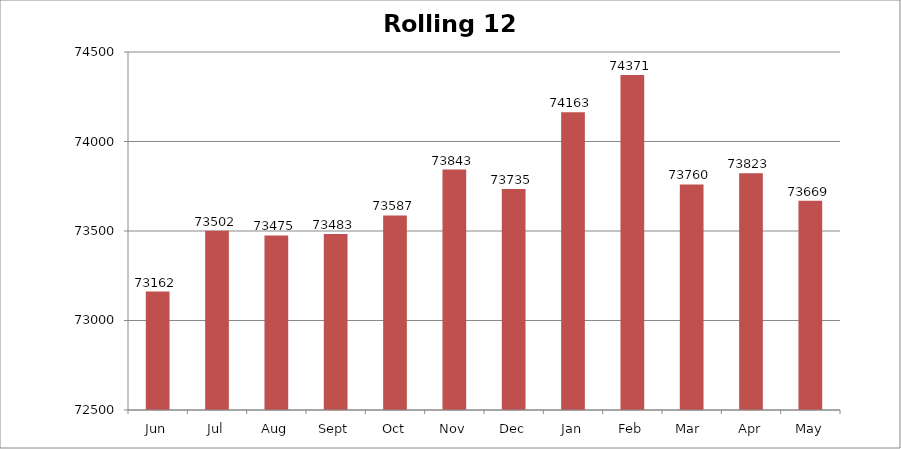
| Category | Rolling 12 Month |
|---|---|
| Jun | 73162 |
| Jul | 73502 |
| Aug | 73475 |
| Sept | 73483 |
| Oct | 73587 |
| Nov | 73843 |
| Dec | 73735 |
| Jan | 74163 |
| Feb | 74371 |
| Mar  | 73760 |
| Apr | 73823 |
| May | 73669 |